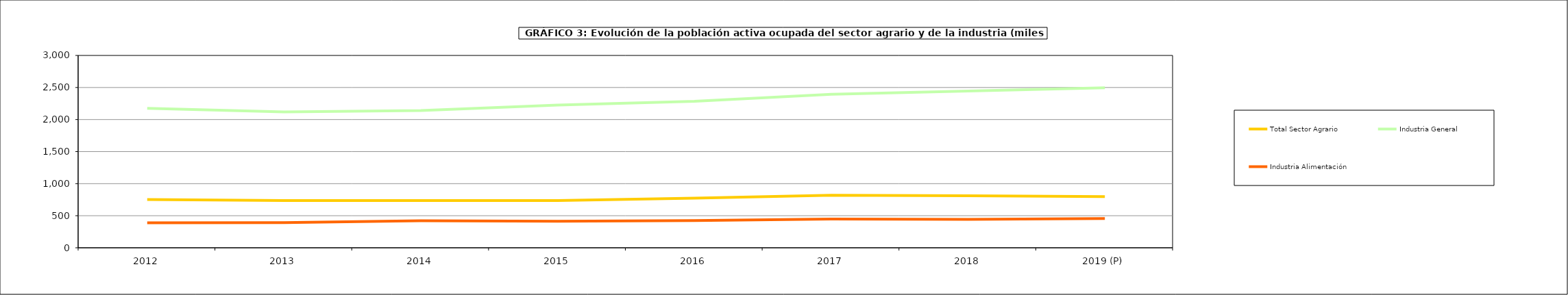
| Category | Total Sector Agrario | Industria General | Industria Alimentación |
|---|---|---|---|
| 2012 | 753.225 | 2175.575 | 388.925 |
| 2013 | 736.6 | 2118.7 | 393.3 |
| 2014 | 735.85 | 2141.4 | 420.65 |
| 2015 | 736.75 | 2225.025 | 414.025 |
| 2016 | 774.5 | 2284.2 | 423.7 |
| 2017 | 819.5 | 2393.4 | 448 |
| 2018 | 812.575 | 2444.2 | 442.4 |
| 2019 (P) | 797.275 | 2494.925 | 456.05 |